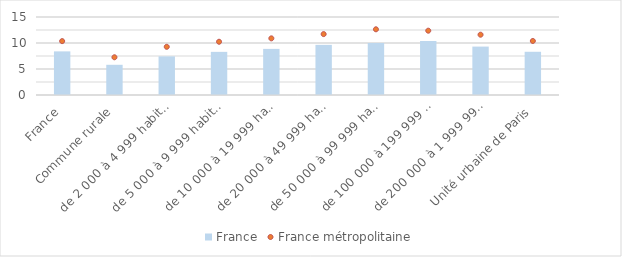
| Category | France |
|---|---|
| France | 8.388 |
| Commune rurale | 5.808 |
|  de 2 000 à 4 999 habitants | 7.428 |
|  de 5 000 à 9 999 habitants | 8.295 |
|  de 10 000 à 19 999 habitants | 8.866 |
|  de 20 000 à 49 999 habitants | 9.642 |
|  de 50 000 à 99 999 habitants | 10.005 |
|  de 100 000 à 199 999 habitants | 10.397 |
|  de 200 000 à 1 999 999 habitants | 9.309 |
| Unité urbaine de Paris | 8.311 |